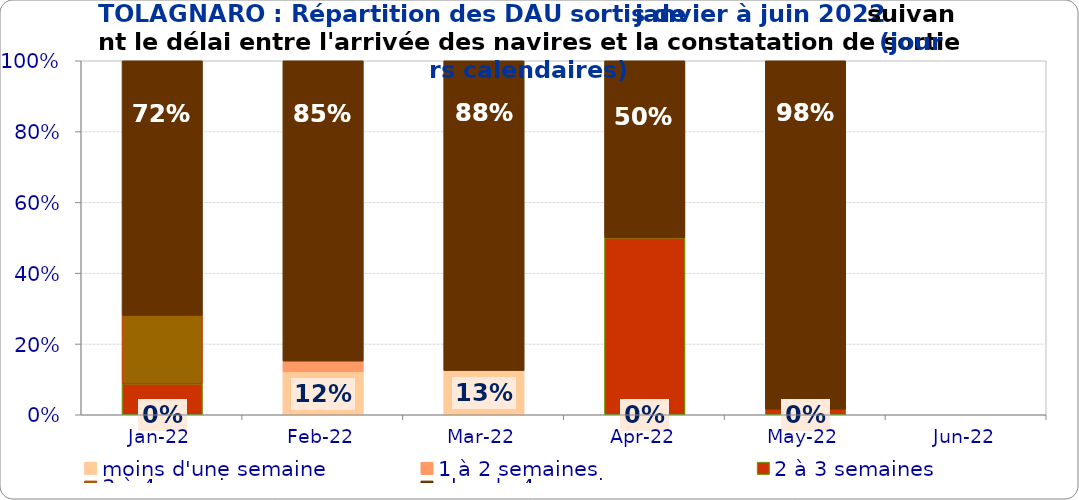
| Category | moins d'une semaine | 1 à 2 semaines | 2 à 3 semaines | 3 à 4 semaines | plus de 4 semaines |
|---|---|---|---|---|---|
| 2022-01-01 | 0 | 0 | 0.088 | 0.193 | 0.719 |
| 2022-02-01 | 0.121 | 0.03 | 0 | 0 | 0.848 |
| 2022-03-01 | 0.125 | 0 | 0 | 0 | 0.875 |
| 2022-04-01 | 0 | 0 | 0.5 | 0 | 0.5 |
| 2022-05-01 | 0 | 0 | 0.015 | 0 | 0.985 |
| 2022-06-01 | 0 | 0 | 0 | 0 | 0 |